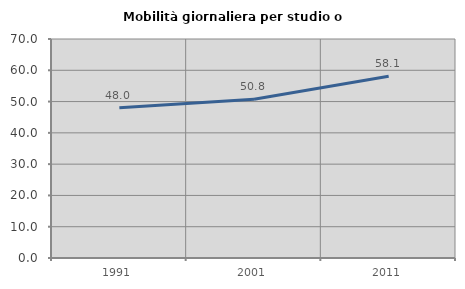
| Category | Mobilità giornaliera per studio o lavoro |
|---|---|
| 1991.0 | 48.029 |
| 2001.0 | 50.754 |
| 2011.0 | 58.12 |